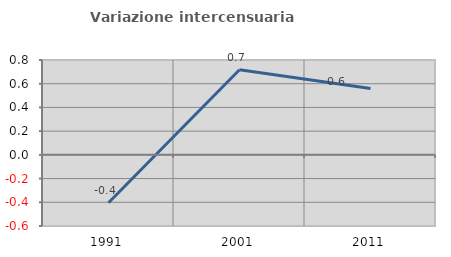
| Category | Variazione intercensuaria annua |
|---|---|
| 1991.0 | -0.404 |
| 2001.0 | 0.718 |
| 2011.0 | 0.559 |